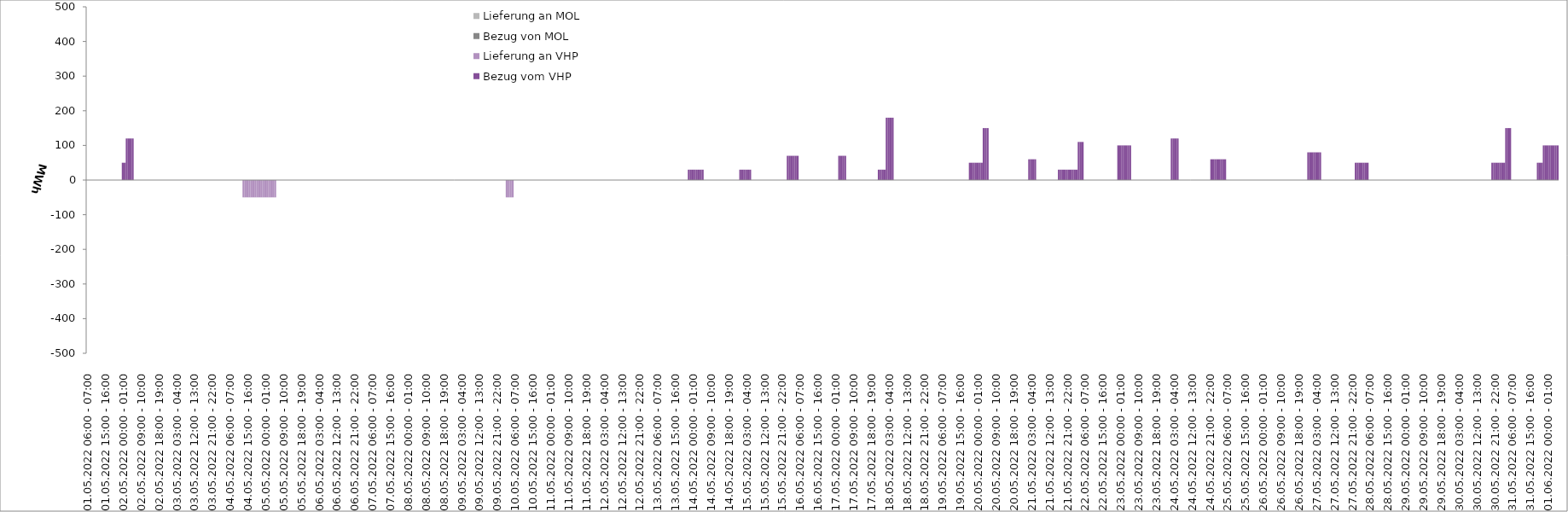
| Category | Bezug vom VHP | Lieferung an VHP | Bezug von MOL | Lieferung an MOL |
|---|---|---|---|---|
| 01.05.2022 06:00 - 07:00 | 0 | 0 | 0 | 0 |
| 01.05.2022 07:00 - 08:00 | 0 | 0 | 0 | 0 |
| 01.05.2022 08:00 - 09:00 | 0 | 0 | 0 | 0 |
| 01.05.2022 09:00 - 10:00 | 0 | 0 | 0 | 0 |
| 01.05.2022 10:00 - 11:00 | 0 | 0 | 0 | 0 |
| 01.05.2022 11:00 - 12:00 | 0 | 0 | 0 | 0 |
| 01.05.2022 12:00 - 13:00 | 0 | 0 | 0 | 0 |
| 01.05.2022 13:00 - 14:00 | 0 | 0 | 0 | 0 |
| 01.05.2022 14:00 - 15:00 | 0 | 0 | 0 | 0 |
| 01.05.2022 15:00 - 16:00 | 0 | 0 | 0 | 0 |
| 01.05.2022 16:00 - 17:00 | 0 | 0 | 0 | 0 |
| 01.05.2022 17:00 - 18:00 | 0 | 0 | 0 | 0 |
| 01.05.2022 18:00 - 19:00 | 0 | 0 | 0 | 0 |
| 01.05.2022 19:00 - 20:00 | 0 | 0 | 0 | 0 |
| 01.05.2022 20:00 - 21:00 | 0 | 0 | 0 | 0 |
| 01.05.2022 21:00 - 22:00 | 0 | 0 | 0 | 0 |
| 01.05.2022 22:00 - 23:00 | 0 | 0 | 0 | 0 |
| 01.05.2022 23:00 - 24:00 | 0 | 0 | 0 | 0 |
| 02.05.2022 00:00 - 01:00 | 50 | 0 | 0 | 0 |
| 02.05.2022 01:00 - 02:00 | 50 | 0 | 0 | 0 |
| 02.05.2022 02:00 - 03:00 | 120 | 0 | 0 | 0 |
| 02.05.2022 03:00 - 04:00 | 120 | 0 | 0 | 0 |
| 02.05.2022 04:00 - 05:00 | 120 | 0 | 0 | 0 |
| 02.05.2022 05:00 - 06:00 | 120 | 0 | 0 | 0 |
| 02.05.2022 06:00 - 07:00 | 0 | 0 | 0 | 0 |
| 02.05.2022 07:00 - 08:00 | 0 | 0 | 0 | 0 |
| 02.05.2022 08:00 - 09:00 | 0 | 0 | 0 | 0 |
| 02.05.2022 09:00 - 10:00 | 0 | 0 | 0 | 0 |
| 02.05.2022 10:00 - 11:00 | 0 | 0 | 0 | 0 |
| 02.05.2022 11:00 - 12:00 | 0 | 0 | 0 | 0 |
| 02.05.2022 12:00 - 13:00 | 0 | 0 | 0 | 0 |
| 02.05.2022 13:00 - 14:00 | 0 | 0 | 0 | 0 |
| 02.05.2022 14:00 - 15:00 | 0 | 0 | 0 | 0 |
| 02.05.2022 15:00 - 16:00 | 0 | 0 | 0 | 0 |
| 02.05.2022 16:00 - 17:00 | 0 | 0 | 0 | 0 |
| 02.05.2022 17:00 - 18:00 | 0 | 0 | 0 | 0 |
| 02.05.2022 18:00 - 19:00 | 0 | 0 | 0 | 0 |
| 02.05.2022 19:00 - 20:00 | 0 | 0 | 0 | 0 |
| 02.05.2022 20:00 - 21:00 | 0 | 0 | 0 | 0 |
| 02.05.2022 21:00 - 22:00 | 0 | 0 | 0 | 0 |
| 02.05.2022 22:00 - 23:00 | 0 | 0 | 0 | 0 |
| 02.05.2022 23:00 - 24:00 | 0 | 0 | 0 | 0 |
| 03.05.2022 00:00 - 01:00 | 0 | 0 | 0 | 0 |
| 03.05.2022 01:00 - 02:00 | 0 | 0 | 0 | 0 |
| 03.05.2022 02:00 - 03:00 | 0 | 0 | 0 | 0 |
| 03.05.2022 03:00 - 04:00 | 0 | 0 | 0 | 0 |
| 03.05.2022 04:00 - 05:00 | 0 | 0 | 0 | 0 |
| 03.05.2022 05:00 - 06:00 | 0 | 0 | 0 | 0 |
| 03.05.2022 06:00 - 07:00 | 0 | 0 | 0 | 0 |
| 03.05.2022 07:00 - 08:00 | 0 | 0 | 0 | 0 |
| 03.05.2022 08:00 - 09:00 | 0 | 0 | 0 | 0 |
| 03.05.2022 09:00 - 10:00 | 0 | 0 | 0 | 0 |
| 03.05.2022 10:00 - 11:00 | 0 | 0 | 0 | 0 |
| 03.05.2022 11:00 - 12:00 | 0 | 0 | 0 | 0 |
| 03.05.2022 12:00 - 13:00 | 0 | 0 | 0 | 0 |
| 03.05.2022 13:00 - 14:00 | 0 | 0 | 0 | 0 |
| 03.05.2022 14:00 - 15:00 | 0 | 0 | 0 | 0 |
| 03.05.2022 15:00 - 16:00 | 0 | 0 | 0 | 0 |
| 03.05.2022 16:00 - 17:00 | 0 | 0 | 0 | 0 |
| 03.05.2022 17:00 - 18:00 | 0 | 0 | 0 | 0 |
| 03.05.2022 18:00 - 19:00 | 0 | 0 | 0 | 0 |
| 03.05.2022 19:00 - 20:00 | 0 | 0 | 0 | 0 |
| 03.05.2022 20:00 - 21:00 | 0 | 0 | 0 | 0 |
| 03.05.2022 21:00 - 22:00 | 0 | 0 | 0 | 0 |
| 03.05.2022 22:00 - 23:00 | 0 | 0 | 0 | 0 |
| 03.05.2022 23:00 - 24:00 | 0 | 0 | 0 | 0 |
| 04.05.2022 00:00 - 01:00 | 0 | 0 | 0 | 0 |
| 04.05.2022 01:00 - 02:00 | 0 | 0 | 0 | 0 |
| 04.05.2022 02:00 - 03:00 | 0 | 0 | 0 | 0 |
| 04.05.2022 03:00 - 04:00 | 0 | 0 | 0 | 0 |
| 04.05.2022 04:00 - 05:00 | 0 | 0 | 0 | 0 |
| 04.05.2022 05:00 - 06:00 | 0 | 0 | 0 | 0 |
| 04.05.2022 06:00 - 07:00 | 0 | 0 | 0 | 0 |
| 04.05.2022 07:00 - 08:00 | 0 | 0 | 0 | 0 |
| 04.05.2022 08:00 - 09:00 | 0 | 0 | 0 | 0 |
| 04.05.2022 09:00 - 10:00 | 0 | 0 | 0 | 0 |
| 04.05.2022 10:00 - 11:00 | 0 | 0 | 0 | 0 |
| 04.05.2022 11:00 - 12:00 | 0 | 0 | 0 | 0 |
| 04.05.2022 12:00 - 13:00 | 0 | 0 | 0 | 0 |
| 04.05.2022 13:00 - 14:00 | 0 | -50 | 0 | 0 |
| 04.05.2022 14:00 - 15:00 | 0 | -50 | 0 | 0 |
| 04.05.2022 15:00 - 16:00 | 0 | -50 | 0 | 0 |
| 04.05.2022 16:00 - 17:00 | 0 | -50 | 0 | 0 |
| 04.05.2022 17:00 - 18:00 | 0 | -50 | 0 | 0 |
| 04.05.2022 18:00 - 19:00 | 0 | -50 | 0 | 0 |
| 04.05.2022 19:00 - 20:00 | 0 | -50 | 0 | 0 |
| 04.05.2022 20:00 - 21:00 | 0 | -50 | 0 | 0 |
| 04.05.2022 21:00 - 22:00 | 0 | -50 | 0 | 0 |
| 04.05.2022 22:00 - 23:00 | 0 | -50 | 0 | 0 |
| 04.05.2022 23:00 - 24:00 | 0 | -50 | 0 | 0 |
| 05.05.2022 00:00 - 01:00 | 0 | -50 | 0 | 0 |
| 05.05.2022 01:00 - 02:00 | 0 | -50 | 0 | 0 |
| 05.05.2022 02:00 - 03:00 | 0 | -50 | 0 | 0 |
| 05.05.2022 03:00 - 04:00 | 0 | -50 | 0 | 0 |
| 05.05.2022 04:00 - 05:00 | 0 | -50 | 0 | 0 |
| 05.05.2022 05:00 - 06:00 | 0 | -50 | 0 | 0 |
| 05.05.2022 06:00 - 07:00 | 0 | 0 | 0 | 0 |
| 05.05.2022 07:00 - 08:00 | 0 | 0 | 0 | 0 |
| 05.05.2022 08:00 - 09:00 | 0 | 0 | 0 | 0 |
| 05.05.2022 09:00 - 10:00 | 0 | 0 | 0 | 0 |
| 05.05.2022 10:00 - 11:00 | 0 | 0 | 0 | 0 |
| 05.05.2022 11:00 - 12:00 | 0 | 0 | 0 | 0 |
| 05.05.2022 12:00 - 13:00 | 0 | 0 | 0 | 0 |
| 05.05.2022 13:00 - 14:00 | 0 | 0 | 0 | 0 |
| 05.05.2022 14:00 - 15:00 | 0 | 0 | 0 | 0 |
| 05.05.2022 15:00 - 16:00 | 0 | 0 | 0 | 0 |
| 05.05.2022 16:00 - 17:00 | 0 | 0 | 0 | 0 |
| 05.05.2022 17:00 - 18:00 | 0 | 0 | 0 | 0 |
| 05.05.2022 18:00 - 19:00 | 0 | 0 | 0 | 0 |
| 05.05.2022 19:00 - 20:00 | 0 | 0 | 0 | 0 |
| 05.05.2022 20:00 - 21:00 | 0 | 0 | 0 | 0 |
| 05.05.2022 21:00 - 22:00 | 0 | 0 | 0 | 0 |
| 05.05.2022 22:00 - 23:00 | 0 | 0 | 0 | 0 |
| 05.05.2022 23:00 - 24:00 | 0 | 0 | 0 | 0 |
| 06.05.2022 00:00 - 01:00 | 0 | 0 | 0 | 0 |
| 06.05.2022 01:00 - 02:00 | 0 | 0 | 0 | 0 |
| 06.05.2022 02:00 - 03:00 | 0 | 0 | 0 | 0 |
| 06.05.2022 03:00 - 04:00 | 0 | 0 | 0 | 0 |
| 06.05.2022 04:00 - 05:00 | 0 | 0 | 0 | 0 |
| 06.05.2022 05:00 - 06:00 | 0 | 0 | 0 | 0 |
| 06.05.2022 06:00 - 07:00 | 0 | 0 | 0 | 0 |
| 06.05.2022 07:00 - 08:00 | 0 | 0 | 0 | 0 |
| 06.05.2022 08:00 - 09:00 | 0 | 0 | 0 | 0 |
| 06.05.2022 09:00 - 10:00 | 0 | 0 | 0 | 0 |
| 06.05.2022 10:00 - 11:00 | 0 | 0 | 0 | 0 |
| 06.05.2022 11:00 - 12:00 | 0 | 0 | 0 | 0 |
| 06.05.2022 12:00 - 13:00 | 0 | 0 | 0 | 0 |
| 06.05.2022 13:00 - 14:00 | 0 | 0 | 0 | 0 |
| 06.05.2022 14:00 - 15:00 | 0 | 0 | 0 | 0 |
| 06.05.2022 15:00 - 16:00 | 0 | 0 | 0 | 0 |
| 06.05.2022 16:00 - 17:00 | 0 | 0 | 0 | 0 |
| 06.05.2022 17:00 - 18:00 | 0 | 0 | 0 | 0 |
| 06.05.2022 18:00 - 19:00 | 0 | 0 | 0 | 0 |
| 06.05.2022 19:00 - 20:00 | 0 | 0 | 0 | 0 |
| 06.05.2022 20:00 - 21:00 | 0 | 0 | 0 | 0 |
| 06.05.2022 21:00 - 22:00 | 0 | 0 | 0 | 0 |
| 06.05.2022 22:00 - 23:00 | 0 | 0 | 0 | 0 |
| 06.05.2022 23:00 - 24:00 | 0 | 0 | 0 | 0 |
| 07.05.2022 00:00 - 01:00 | 0 | 0 | 0 | 0 |
| 07.05.2022 01:00 - 02:00 | 0 | 0 | 0 | 0 |
| 07.05.2022 02:00 - 03:00 | 0 | 0 | 0 | 0 |
| 07.05.2022 03:00 - 04:00 | 0 | 0 | 0 | 0 |
| 07.05.2022 04:00 - 05:00 | 0 | 0 | 0 | 0 |
| 07.05.2022 05:00 - 06:00 | 0 | 0 | 0 | 0 |
| 07.05.2022 06:00 - 07:00 | 0 | 0 | 0 | 0 |
| 07.05.2022 07:00 - 08:00 | 0 | 0 | 0 | 0 |
| 07.05.2022 08:00 - 09:00 | 0 | 0 | 0 | 0 |
| 07.05.2022 09:00 - 10:00 | 0 | 0 | 0 | 0 |
| 07.05.2022 10:00 - 11:00 | 0 | 0 | 0 | 0 |
| 07.05.2022 11:00 - 12:00 | 0 | 0 | 0 | 0 |
| 07.05.2022 12:00 - 13:00 | 0 | 0 | 0 | 0 |
| 07.05.2022 13:00 - 14:00 | 0 | 0 | 0 | 0 |
| 07.05.2022 14:00 - 15:00 | 0 | 0 | 0 | 0 |
| 07.05.2022 15:00 - 16:00 | 0 | 0 | 0 | 0 |
| 07.05.2022 16:00 - 17:00 | 0 | 0 | 0 | 0 |
| 07.05.2022 17:00 - 18:00 | 0 | 0 | 0 | 0 |
| 07.05.2022 18:00 - 19:00 | 0 | 0 | 0 | 0 |
| 07.05.2022 19:00 - 20:00 | 0 | 0 | 0 | 0 |
| 07.05.2022 20:00 - 21:00 | 0 | 0 | 0 | 0 |
| 07.05.2022 21:00 - 22:00 | 0 | 0 | 0 | 0 |
| 07.05.2022 22:00 - 23:00 | 0 | 0 | 0 | 0 |
| 07.05.2022 23:00 - 24:00 | 0 | 0 | 0 | 0 |
| 08.05.2022 00:00 - 01:00 | 0 | 0 | 0 | 0 |
| 08.05.2022 01:00 - 02:00 | 0 | 0 | 0 | 0 |
| 08.05.2022 02:00 - 03:00 | 0 | 0 | 0 | 0 |
| 08.05.2022 03:00 - 04:00 | 0 | 0 | 0 | 0 |
| 08.05.2022 04:00 - 05:00 | 0 | 0 | 0 | 0 |
| 08.05.2022 05:00 - 06:00 | 0 | 0 | 0 | 0 |
| 08.05.2022 06:00 - 07:00 | 0 | 0 | 0 | 0 |
| 08.05.2022 07:00 - 08:00 | 0 | 0 | 0 | 0 |
| 08.05.2022 08:00 - 09:00 | 0 | 0 | 0 | 0 |
| 08.05.2022 09:00 - 10:00 | 0 | 0 | 0 | 0 |
| 08.05.2022 10:00 - 11:00 | 0 | 0 | 0 | 0 |
| 08.05.2022 11:00 - 12:00 | 0 | 0 | 0 | 0 |
| 08.05.2022 12:00 - 13:00 | 0 | 0 | 0 | 0 |
| 08.05.2022 13:00 - 14:00 | 0 | 0 | 0 | 0 |
| 08.05.2022 14:00 - 15:00 | 0 | 0 | 0 | 0 |
| 08.05.2022 15:00 - 16:00 | 0 | 0 | 0 | 0 |
| 08.05.2022 16:00 - 17:00 | 0 | 0 | 0 | 0 |
| 08.05.2022 17:00 - 18:00 | 0 | 0 | 0 | 0 |
| 08.05.2022 18:00 - 19:00 | 0 | 0 | 0 | 0 |
| 08.05.2022 19:00 - 20:00 | 0 | 0 | 0 | 0 |
| 08.05.2022 20:00 - 21:00 | 0 | 0 | 0 | 0 |
| 08.05.2022 21:00 - 22:00 | 0 | 0 | 0 | 0 |
| 08.05.2022 22:00 - 23:00 | 0 | 0 | 0 | 0 |
| 08.05.2022 23:00 - 24:00 | 0 | 0 | 0 | 0 |
| 09.05.2022 00:00 - 01:00 | 0 | 0 | 0 | 0 |
| 09.05.2022 01:00 - 02:00 | 0 | 0 | 0 | 0 |
| 09.05.2022 02:00 - 03:00 | 0 | 0 | 0 | 0 |
| 09.05.2022 03:00 - 04:00 | 0 | 0 | 0 | 0 |
| 09.05.2022 04:00 - 05:00 | 0 | 0 | 0 | 0 |
| 09.05.2022 05:00 - 06:00 | 0 | 0 | 0 | 0 |
| 09.05.2022 06:00 - 07:00 | 0 | 0 | 0 | 0 |
| 09.05.2022 07:00 - 08:00 | 0 | 0 | 0 | 0 |
| 09.05.2022 08:00 - 09:00 | 0 | 0 | 0 | 0 |
| 09.05.2022 09:00 - 10:00 | 0 | 0 | 0 | 0 |
| 09.05.2022 10:00 - 11:00 | 0 | 0 | 0 | 0 |
| 09.05.2022 11:00 - 12:00 | 0 | 0 | 0 | 0 |
| 09.05.2022 12:00 - 13:00 | 0 | 0 | 0 | 0 |
| 09.05.2022 13:00 - 14:00 | 0 | 0 | 0 | 0 |
| 09.05.2022 14:00 - 15:00 | 0 | 0 | 0 | 0 |
| 09.05.2022 15:00 - 16:00 | 0 | 0 | 0 | 0 |
| 09.05.2022 16:00 - 17:00 | 0 | 0 | 0 | 0 |
| 09.05.2022 17:00 - 18:00 | 0 | 0 | 0 | 0 |
| 09.05.2022 18:00 - 19:00 | 0 | 0 | 0 | 0 |
| 09.05.2022 19:00 - 20:00 | 0 | 0 | 0 | 0 |
| 09.05.2022 20:00 - 21:00 | 0 | 0 | 0 | 0 |
| 09.05.2022 21:00 - 22:00 | 0 | 0 | 0 | 0 |
| 09.05.2022 22:00 - 23:00 | 0 | 0 | 0 | 0 |
| 09.05.2022 23:00 - 24:00 | 0 | 0 | 0 | 0 |
| 10.05.2022 00:00 - 01:00 | 0 | 0 | 0 | 0 |
| 10.05.2022 01:00 - 02:00 | 0 | 0 | 0 | 0 |
| 10.05.2022 02:00 - 03:00 | 0 | -50 | 0 | 0 |
| 10.05.2022 03:00 - 04:00 | 0 | -50 | 0 | 0 |
| 10.05.2022 04:00 - 05:00 | 0 | -50 | 0 | 0 |
| 10.05.2022 05:00 - 06:00 | 0 | -50 | 0 | 0 |
| 10.05.2022 06:00 - 07:00 | 0 | 0 | 0 | 0 |
| 10.05.2022 07:00 - 08:00 | 0 | 0 | 0 | 0 |
| 10.05.2022 08:00 - 09:00 | 0 | 0 | 0 | 0 |
| 10.05.2022 09:00 - 10:00 | 0 | 0 | 0 | 0 |
| 10.05.2022 10:00 - 11:00 | 0 | 0 | 0 | 0 |
| 10.05.2022 11:00 - 12:00 | 0 | 0 | 0 | 0 |
| 10.05.2022 12:00 - 13:00 | 0 | 0 | 0 | 0 |
| 10.05.2022 13:00 - 14:00 | 0 | 0 | 0 | 0 |
| 10.05.2022 14:00 - 15:00 | 0 | 0 | 0 | 0 |
| 10.05.2022 15:00 - 16:00 | 0 | 0 | 0 | 0 |
| 10.05.2022 16:00 - 17:00 | 0 | 0 | 0 | 0 |
| 10.05.2022 17:00 - 18:00 | 0 | 0 | 0 | 0 |
| 10.05.2022 18:00 - 19:00 | 0 | 0 | 0 | 0 |
| 10.05.2022 19:00 - 20:00 | 0 | 0 | 0 | 0 |
| 10.05.2022 20:00 - 21:00 | 0 | 0 | 0 | 0 |
| 10.05.2022 21:00 - 22:00 | 0 | 0 | 0 | 0 |
| 10.05.2022 22:00 - 23:00 | 0 | 0 | 0 | 0 |
| 10.05.2022 23:00 - 24:00 | 0 | 0 | 0 | 0 |
| 11.05.2022 00:00 - 01:00 | 0 | 0 | 0 | 0 |
| 11.05.2022 01:00 - 02:00 | 0 | 0 | 0 | 0 |
| 11.05.2022 02:00 - 03:00 | 0 | 0 | 0 | 0 |
| 11.05.2022 03:00 - 04:00 | 0 | 0 | 0 | 0 |
| 11.05.2022 04:00 - 05:00 | 0 | 0 | 0 | 0 |
| 11.05.2022 05:00 - 06:00 | 0 | 0 | 0 | 0 |
| 11.05.2022 06:00 - 07:00 | 0 | 0 | 0 | 0 |
| 11.05.2022 07:00 - 08:00 | 0 | 0 | 0 | 0 |
| 11.05.2022 08:00 - 09:00 | 0 | 0 | 0 | 0 |
| 11.05.2022 09:00 - 10:00 | 0 | 0 | 0 | 0 |
| 11.05.2022 10:00 - 11:00 | 0 | 0 | 0 | 0 |
| 11.05.2022 11:00 - 12:00 | 0 | 0 | 0 | 0 |
| 11.05.2022 12:00 - 13:00 | 0 | 0 | 0 | 0 |
| 11.05.2022 13:00 - 14:00 | 0 | 0 | 0 | 0 |
| 11.05.2022 14:00 - 15:00 | 0 | 0 | 0 | 0 |
| 11.05.2022 15:00 - 16:00 | 0 | 0 | 0 | 0 |
| 11.05.2022 16:00 - 17:00 | 0 | 0 | 0 | 0 |
| 11.05.2022 17:00 - 18:00 | 0 | 0 | 0 | 0 |
| 11.05.2022 18:00 - 19:00 | 0 | 0 | 0 | 0 |
| 11.05.2022 19:00 - 20:00 | 0 | 0 | 0 | 0 |
| 11.05.2022 20:00 - 21:00 | 0 | 0 | 0 | 0 |
| 11.05.2022 21:00 - 22:00 | 0 | 0 | 0 | 0 |
| 11.05.2022 22:00 - 23:00 | 0 | 0 | 0 | 0 |
| 11.05.2022 23:00 - 24:00 | 0 | 0 | 0 | 0 |
| 12.05.2022 00:00 - 01:00 | 0 | 0 | 0 | 0 |
| 12.05.2022 01:00 - 02:00 | 0 | 0 | 0 | 0 |
| 12.05.2022 02:00 - 03:00 | 0 | 0 | 0 | 0 |
| 12.05.2022 03:00 - 04:00 | 0 | 0 | 0 | 0 |
| 12.05.2022 04:00 - 05:00 | 0 | 0 | 0 | 0 |
| 12.05.2022 05:00 - 06:00 | 0 | 0 | 0 | 0 |
| 12.05.2022 06:00 - 07:00 | 0 | 0 | 0 | 0 |
| 12.05.2022 07:00 - 08:00 | 0 | 0 | 0 | 0 |
| 12.05.2022 08:00 - 09:00 | 0 | 0 | 0 | 0 |
| 12.05.2022 09:00 - 10:00 | 0 | 0 | 0 | 0 |
| 12.05.2022 10:00 - 11:00 | 0 | 0 | 0 | 0 |
| 12.05.2022 11:00 - 12:00 | 0 | 0 | 0 | 0 |
| 12.05.2022 12:00 - 13:00 | 0 | 0 | 0 | 0 |
| 12.05.2022 13:00 - 14:00 | 0 | 0 | 0 | 0 |
| 12.05.2022 14:00 - 15:00 | 0 | 0 | 0 | 0 |
| 12.05.2022 15:00 - 16:00 | 0 | 0 | 0 | 0 |
| 12.05.2022 16:00 - 17:00 | 0 | 0 | 0 | 0 |
| 12.05.2022 17:00 - 18:00 | 0 | 0 | 0 | 0 |
| 12.05.2022 18:00 - 19:00 | 0 | 0 | 0 | 0 |
| 12.05.2022 19:00 - 20:00 | 0 | 0 | 0 | 0 |
| 12.05.2022 20:00 - 21:00 | 0 | 0 | 0 | 0 |
| 12.05.2022 21:00 - 22:00 | 0 | 0 | 0 | 0 |
| 12.05.2022 22:00 - 23:00 | 0 | 0 | 0 | 0 |
| 12.05.2022 23:00 - 24:00 | 0 | 0 | 0 | 0 |
| 13.05.2022 00:00 - 01:00 | 0 | 0 | 0 | 0 |
| 13.05.2022 01:00 - 02:00 | 0 | 0 | 0 | 0 |
| 13.05.2022 02:00 - 03:00 | 0 | 0 | 0 | 0 |
| 13.05.2022 03:00 - 04:00 | 0 | 0 | 0 | 0 |
| 13.05.2022 04:00 - 05:00 | 0 | 0 | 0 | 0 |
| 13.05.2022 05:00 - 06:00 | 0 | 0 | 0 | 0 |
| 13.05.2022 06:00 - 07:00 | 0 | 0 | 0 | 0 |
| 13.05.2022 07:00 - 08:00 | 0 | 0 | 0 | 0 |
| 13.05.2022 08:00 - 09:00 | 0 | 0 | 0 | 0 |
| 13.05.2022 09:00 - 10:00 | 0 | 0 | 0 | 0 |
| 13.05.2022 10:00 - 11:00 | 0 | 0 | 0 | 0 |
| 13.05.2022 11:00 - 12:00 | 0 | 0 | 0 | 0 |
| 13.05.2022 12:00 - 13:00 | 0 | 0 | 0 | 0 |
| 13.05.2022 13:00 - 14:00 | 0 | 0 | 0 | 0 |
| 13.05.2022 14:00 - 15:00 | 0 | 0 | 0 | 0 |
| 13.05.2022 15:00 - 16:00 | 0 | 0 | 0 | 0 |
| 13.05.2022 16:00 - 17:00 | 0 | 0 | 0 | 0 |
| 13.05.2022 17:00 - 18:00 | 0 | 0 | 0 | 0 |
| 13.05.2022 18:00 - 19:00 | 0 | 0 | 0 | 0 |
| 13.05.2022 19:00 - 20:00 | 0 | 0 | 0 | 0 |
| 13.05.2022 20:00 - 21:00 | 0 | 0 | 0 | 0 |
| 13.05.2022 21:00 - 22:00 | 0 | 0 | 0 | 0 |
| 13.05.2022 22:00 - 23:00 | 30 | 0 | 0 | 0 |
| 13.05.2022 23:00 - 24:00 | 30 | 0 | 0 | 0 |
| 14.05.2022 00:00 - 01:00 | 30 | 0 | 0 | 0 |
| 14.05.2022 01:00 - 02:00 | 30 | 0 | 0 | 0 |
| 14.05.2022 02:00 - 03:00 | 30 | 0 | 0 | 0 |
| 14.05.2022 03:00 - 04:00 | 30 | 0 | 0 | 0 |
| 14.05.2022 04:00 - 05:00 | 30 | 0 | 0 | 0 |
| 14.05.2022 05:00 - 06:00 | 30 | 0 | 0 | 0 |
| 14.05.2022 06:00 - 07:00 | 0 | 0 | 0 | 0 |
| 14.05.2022 07:00 - 08:00 | 0 | 0 | 0 | 0 |
| 14.05.2022 08:00 - 09:00 | 0 | 0 | 0 | 0 |
| 14.05.2022 09:00 - 10:00 | 0 | 0 | 0 | 0 |
| 14.05.2022 10:00 - 11:00 | 0 | 0 | 0 | 0 |
| 14.05.2022 11:00 - 12:00 | 0 | 0 | 0 | 0 |
| 14.05.2022 12:00 - 13:00 | 0 | 0 | 0 | 0 |
| 14.05.2022 13:00 - 14:00 | 0 | 0 | 0 | 0 |
| 14.05.2022 14:00 - 15:00 | 0 | 0 | 0 | 0 |
| 14.05.2022 15:00 - 16:00 | 0 | 0 | 0 | 0 |
| 14.05.2022 16:00 - 17:00 | 0 | 0 | 0 | 0 |
| 14.05.2022 17:00 - 18:00 | 0 | 0 | 0 | 0 |
| 14.05.2022 18:00 - 19:00 | 0 | 0 | 0 | 0 |
| 14.05.2022 19:00 - 20:00 | 0 | 0 | 0 | 0 |
| 14.05.2022 20:00 - 21:00 | 0 | 0 | 0 | 0 |
| 14.05.2022 21:00 - 22:00 | 0 | 0 | 0 | 0 |
| 14.05.2022 22:00 - 23:00 | 0 | 0 | 0 | 0 |
| 14.05.2022 23:00 - 24:00 | 0 | 0 | 0 | 0 |
| 15.05.2022 00:00 - 01:00 | 30 | 0 | 0 | 0 |
| 15.05.2022 01:00 - 02:00 | 30 | 0 | 0 | 0 |
| 15.05.2022 02:00 - 03:00 | 30 | 0 | 0 | 0 |
| 15.05.2022 03:00 - 04:00 | 30 | 0 | 0 | 0 |
| 15.05.2022 04:00 - 05:00 | 30 | 0 | 0 | 0 |
| 15.05.2022 05:00 - 06:00 | 30 | 0 | 0 | 0 |
| 15.05.2022 06:00 - 07:00 | 0 | 0 | 0 | 0 |
| 15.05.2022 07:00 - 08:00 | 0 | 0 | 0 | 0 |
| 15.05.2022 08:00 - 09:00 | 0 | 0 | 0 | 0 |
| 15.05.2022 09:00 - 10:00 | 0 | 0 | 0 | 0 |
| 15.05.2022 10:00 - 11:00 | 0 | 0 | 0 | 0 |
| 15.05.2022 11:00 - 12:00 | 0 | 0 | 0 | 0 |
| 15.05.2022 12:00 - 13:00 | 0 | 0 | 0 | 0 |
| 15.05.2022 13:00 - 14:00 | 0 | 0 | 0 | 0 |
| 15.05.2022 14:00 - 15:00 | 0 | 0 | 0 | 0 |
| 15.05.2022 15:00 - 16:00 | 0 | 0 | 0 | 0 |
| 15.05.2022 16:00 - 17:00 | 0 | 0 | 0 | 0 |
| 15.05.2022 17:00 - 18:00 | 0 | 0 | 0 | 0 |
| 15.05.2022 18:00 - 19:00 | 0 | 0 | 0 | 0 |
| 15.05.2022 19:00 - 20:00 | 0 | 0 | 0 | 0 |
| 15.05.2022 20:00 - 21:00 | 0 | 0 | 0 | 0 |
| 15.05.2022 21:00 - 22:00 | 0 | 0 | 0 | 0 |
| 15.05.2022 22:00 - 23:00 | 0 | 0 | 0 | 0 |
| 15.05.2022 23:00 - 24:00 | 0 | 0 | 0 | 0 |
| 16.05.2022 00:00 - 01:00 | 70 | 0 | 0 | 0 |
| 16.05.2022 01:00 - 02:00 | 70 | 0 | 0 | 0 |
| 16.05.2022 02:00 - 03:00 | 70 | 0 | 0 | 0 |
| 16.05.2022 03:00 - 04:00 | 70 | 0 | 0 | 0 |
| 16.05.2022 04:00 - 05:00 | 70 | 0 | 0 | 0 |
| 16.05.2022 05:00 - 06:00 | 70 | 0 | 0 | 0 |
| 16.05.2022 06:00 - 07:00 | 0 | 0 | 0 | 0 |
| 16.05.2022 07:00 - 08:00 | 0 | 0 | 0 | 0 |
| 16.05.2022 08:00 - 09:00 | 0 | 0 | 0 | 0 |
| 16.05.2022 09:00 - 10:00 | 0 | 0 | 0 | 0 |
| 16.05.2022 10:00 - 11:00 | 0 | 0 | 0 | 0 |
| 16.05.2022 11:00 - 12:00 | 0 | 0 | 0 | 0 |
| 16.05.2022 12:00 - 13:00 | 0 | 0 | 0 | 0 |
| 16.05.2022 13:00 - 14:00 | 0 | 0 | 0 | 0 |
| 16.05.2022 14:00 - 15:00 | 0 | 0 | 0 | 0 |
| 16.05.2022 15:00 - 16:00 | 0 | 0 | 0 | 0 |
| 16.05.2022 16:00 - 17:00 | 0 | 0 | 0 | 0 |
| 16.05.2022 17:00 - 18:00 | 0 | 0 | 0 | 0 |
| 16.05.2022 18:00 - 19:00 | 0 | 0 | 0 | 0 |
| 16.05.2022 19:00 - 20:00 | 0 | 0 | 0 | 0 |
| 16.05.2022 20:00 - 21:00 | 0 | 0 | 0 | 0 |
| 16.05.2022 21:00 - 22:00 | 0 | 0 | 0 | 0 |
| 16.05.2022 22:00 - 23:00 | 0 | 0 | 0 | 0 |
| 16.05.2022 23:00 - 24:00 | 0 | 0 | 0 | 0 |
| 17.05.2022 00:00 - 01:00 | 0 | 0 | 0 | 0 |
| 17.05.2022 01:00 - 02:00 | 0 | 0 | 0 | 0 |
| 17.05.2022 02:00 - 03:00 | 70 | 0 | 0 | 0 |
| 17.05.2022 03:00 - 04:00 | 70 | 0 | 0 | 0 |
| 17.05.2022 04:00 - 05:00 | 70 | 0 | 0 | 0 |
| 17.05.2022 05:00 - 06:00 | 70 | 0 | 0 | 0 |
| 17.05.2022 06:00 - 07:00 | 0 | 0 | 0 | 0 |
| 17.05.2022 07:00 - 08:00 | 0 | 0 | 0 | 0 |
| 17.05.2022 08:00 - 09:00 | 0 | 0 | 0 | 0 |
| 17.05.2022 09:00 - 10:00 | 0 | 0 | 0 | 0 |
| 17.05.2022 10:00 - 11:00 | 0 | 0 | 0 | 0 |
| 17.05.2022 11:00 - 12:00 | 0 | 0 | 0 | 0 |
| 17.05.2022 12:00 - 13:00 | 0 | 0 | 0 | 0 |
| 17.05.2022 13:00 - 14:00 | 0 | 0 | 0 | 0 |
| 17.05.2022 14:00 - 15:00 | 0 | 0 | 0 | 0 |
| 17.05.2022 15:00 - 16:00 | 0 | 0 | 0 | 0 |
| 17.05.2022 16:00 - 17:00 | 0 | 0 | 0 | 0 |
| 17.05.2022 17:00 - 18:00 | 0 | 0 | 0 | 0 |
| 17.05.2022 18:00 - 19:00 | 0 | 0 | 0 | 0 |
| 17.05.2022 19:00 - 20:00 | 0 | 0 | 0 | 0 |
| 17.05.2022 20:00 - 21:00 | 0 | 0 | 0 | 0 |
| 17.05.2022 21:00 - 22:00 | 0 | 0 | 0 | 0 |
| 17.05.2022 22:00 - 23:00 | 30 | 0 | 0 | 0 |
| 17.05.2022 23:00 - 24:00 | 30 | 0 | 0 | 0 |
| 18.05.2022 00:00 - 01:00 | 30 | 0 | 0 | 0 |
| 18.05.2022 01:00 - 02:00 | 30 | 0 | 0 | 0 |
| 18.05.2022 02:00 - 03:00 | 180 | 0 | 0 | 0 |
| 18.05.2022 03:00 - 04:00 | 180 | 0 | 0 | 0 |
| 18.05.2022 04:00 - 05:00 | 180 | 0 | 0 | 0 |
| 18.05.2022 05:00 - 06:00 | 180 | 0 | 0 | 0 |
| 18.05.2022 06:00 - 07:00 | 0 | 0 | 0 | 0 |
| 18.05.2022 07:00 - 08:00 | 0 | 0 | 0 | 0 |
| 18.05.2022 08:00 - 09:00 | 0 | 0 | 0 | 0 |
| 18.05.2022 09:00 - 10:00 | 0 | 0 | 0 | 0 |
| 18.05.2022 10:00 - 11:00 | 0 | 0 | 0 | 0 |
| 18.05.2022 11:00 - 12:00 | 0 | 0 | 0 | 0 |
| 18.05.2022 12:00 - 13:00 | 0 | 0 | 0 | 0 |
| 18.05.2022 13:00 - 14:00 | 0 | 0 | 0 | 0 |
| 18.05.2022 14:00 - 15:00 | 0 | 0 | 0 | 0 |
| 18.05.2022 15:00 - 16:00 | 0 | 0 | 0 | 0 |
| 18.05.2022 16:00 - 17:00 | 0 | 0 | 0 | 0 |
| 18.05.2022 17:00 - 18:00 | 0 | 0 | 0 | 0 |
| 18.05.2022 18:00 - 19:00 | 0 | 0 | 0 | 0 |
| 18.05.2022 19:00 - 20:00 | 0 | 0 | 0 | 0 |
| 18.05.2022 20:00 - 21:00 | 0 | 0 | 0 | 0 |
| 18.05.2022 21:00 - 22:00 | 0 | 0 | 0 | 0 |
| 18.05.2022 22:00 - 23:00 | 0 | 0 | 0 | 0 |
| 18.05.2022 23:00 - 24:00 | 0 | 0 | 0 | 0 |
| 19.05.2022 00:00 - 01:00 | 0 | 0 | 0 | 0 |
| 19.05.2022 01:00 - 02:00 | 0 | 0 | 0 | 0 |
| 19.05.2022 02:00 - 03:00 | 0 | 0 | 0 | 0 |
| 19.05.2022 03:00 - 04:00 | 0 | 0 | 0 | 0 |
| 19.05.2022 04:00 - 05:00 | 0 | 0 | 0 | 0 |
| 19.05.2022 05:00 - 06:00 | 0 | 0 | 0 | 0 |
| 19.05.2022 06:00 - 07:00 | 0 | 0 | 0 | 0 |
| 19.05.2022 07:00 - 08:00 | 0 | 0 | 0 | 0 |
| 19.05.2022 08:00 - 09:00 | 0 | 0 | 0 | 0 |
| 19.05.2022 09:00 - 10:00 | 0 | 0 | 0 | 0 |
| 19.05.2022 10:00 - 11:00 | 0 | 0 | 0 | 0 |
| 19.05.2022 11:00 - 12:00 | 0 | 0 | 0 | 0 |
| 19.05.2022 12:00 - 13:00 | 0 | 0 | 0 | 0 |
| 19.05.2022 13:00 - 14:00 | 0 | 0 | 0 | 0 |
| 19.05.2022 14:00 - 15:00 | 0 | 0 | 0 | 0 |
| 19.05.2022 15:00 - 16:00 | 0 | 0 | 0 | 0 |
| 19.05.2022 16:00 - 17:00 | 0 | 0 | 0 | 0 |
| 19.05.2022 17:00 - 18:00 | 0 | 0 | 0 | 0 |
| 19.05.2022 18:00 - 19:00 | 0 | 0 | 0 | 0 |
| 19.05.2022 19:00 - 20:00 | 0 | 0 | 0 | 0 |
| 19.05.2022 20:00 - 21:00 | 50 | 0 | 0 | 0 |
| 19.05.2022 21:00 - 22:00 | 50 | 0 | 0 | 0 |
| 19.05.2022 22:00 - 23:00 | 50 | 0 | 0 | 0 |
| 19.05.2022 23:00 - 24:00 | 50 | 0 | 0 | 0 |
| 20.05.2022 00:00 - 01:00 | 50 | 0 | 0 | 0 |
| 20.05.2022 01:00 - 02:00 | 50 | 0 | 0 | 0 |
| 20.05.2022 02:00 - 03:00 | 50 | 0 | 0 | 0 |
| 20.05.2022 03:00 - 04:00 | 150 | 0 | 0 | 0 |
| 20.05.2022 04:00 - 05:00 | 150 | 0 | 0 | 0 |
| 20.05.2022 05:00 - 06:00 | 150 | 0 | 0 | 0 |
| 20.05.2022 06:00 - 07:00 | 0 | 0 | 0 | 0 |
| 20.05.2022 07:00 - 08:00 | 0 | 0 | 0 | 0 |
| 20.05.2022 08:00 - 09:00 | 0 | 0 | 0 | 0 |
| 20.05.2022 09:00 - 10:00 | 0 | 0 | 0 | 0 |
| 20.05.2022 10:00 - 11:00 | 0 | 0 | 0 | 0 |
| 20.05.2022 11:00 - 12:00 | 0 | 0 | 0 | 0 |
| 20.05.2022 12:00 - 13:00 | 0 | 0 | 0 | 0 |
| 20.05.2022 13:00 - 14:00 | 0 | 0 | 0 | 0 |
| 20.05.2022 14:00 - 15:00 | 0 | 0 | 0 | 0 |
| 20.05.2022 15:00 - 16:00 | 0 | 0 | 0 | 0 |
| 20.05.2022 16:00 - 17:00 | 0 | 0 | 0 | 0 |
| 20.05.2022 17:00 - 18:00 | 0 | 0 | 0 | 0 |
| 20.05.2022 18:00 - 19:00 | 0 | 0 | 0 | 0 |
| 20.05.2022 19:00 - 20:00 | 0 | 0 | 0 | 0 |
| 20.05.2022 20:00 - 21:00 | 0 | 0 | 0 | 0 |
| 20.05.2022 21:00 - 22:00 | 0 | 0 | 0 | 0 |
| 20.05.2022 22:00 - 23:00 | 0 | 0 | 0 | 0 |
| 20.05.2022 23:00 - 24:00 | 0 | 0 | 0 | 0 |
| 21.05.2022 00:00 - 01:00 | 0 | 0 | 0 | 0 |
| 21.05.2022 01:00 - 02:00 | 0 | 0 | 0 | 0 |
| 21.05.2022 02:00 - 03:00 | 60 | 0 | 0 | 0 |
| 21.05.2022 03:00 - 04:00 | 60 | 0 | 0 | 0 |
| 21.05.2022 04:00 - 05:00 | 60 | 0 | 0 | 0 |
| 21.05.2022 05:00 - 06:00 | 60 | 0 | 0 | 0 |
| 21.05.2022 06:00 - 07:00 | 0 | 0 | 0 | 0 |
| 21.05.2022 07:00 - 08:00 | 0 | 0 | 0 | 0 |
| 21.05.2022 08:00 - 09:00 | 0 | 0 | 0 | 0 |
| 21.05.2022 09:00 - 10:00 | 0 | 0 | 0 | 0 |
| 21.05.2022 10:00 - 11:00 | 0 | 0 | 0 | 0 |
| 21.05.2022 11:00 - 12:00 | 0 | 0 | 0 | 0 |
| 21.05.2022 12:00 - 13:00 | 0 | 0 | 0 | 0 |
| 21.05.2022 13:00 - 14:00 | 0 | 0 | 0 | 0 |
| 21.05.2022 14:00 - 15:00 | 0 | 0 | 0 | 0 |
| 21.05.2022 15:00 - 16:00 | 0 | 0 | 0 | 0 |
| 21.05.2022 16:00 - 17:00 | 0 | 0 | 0 | 0 |
| 21.05.2022 17:00 - 18:00 | 30 | 0 | 0 | 0 |
| 21.05.2022 18:00 - 19:00 | 30 | 0 | 0 | 0 |
| 21.05.2022 19:00 - 20:00 | 30 | 0 | 0 | 0 |
| 21.05.2022 20:00 - 21:00 | 30 | 0 | 0 | 0 |
| 21.05.2022 21:00 - 22:00 | 30 | 0 | 0 | 0 |
| 21.05.2022 22:00 - 23:00 | 30 | 0 | 0 | 0 |
| 21.05.2022 23:00 - 24:00 | 30 | 0 | 0 | 0 |
| 22.05.2022 00:00 - 01:00 | 30 | 0 | 0 | 0 |
| 22.05.2022 01:00 - 02:00 | 30 | 0 | 0 | 0 |
| 22.05.2022 02:00 - 03:00 | 30 | 0 | 0 | 0 |
| 22.05.2022 03:00 - 04:00 | 110 | 0 | 0 | 0 |
| 22.05.2022 04:00 - 05:00 | 110 | 0 | 0 | 0 |
| 22.05.2022 05:00 - 06:00 | 110 | 0 | 0 | 0 |
| 22.05.2022 06:00 - 07:00 | 0 | 0 | 0 | 0 |
| 22.05.2022 07:00 - 08:00 | 0 | 0 | 0 | 0 |
| 22.05.2022 08:00 - 09:00 | 0 | 0 | 0 | 0 |
| 22.05.2022 09:00 - 10:00 | 0 | 0 | 0 | 0 |
| 22.05.2022 10:00 - 11:00 | 0 | 0 | 0 | 0 |
| 22.05.2022 11:00 - 12:00 | 0 | 0 | 0 | 0 |
| 22.05.2022 12:00 - 13:00 | 0 | 0 | 0 | 0 |
| 22.05.2022 13:00 - 14:00 | 0 | 0 | 0 | 0 |
| 22.05.2022 14:00 - 15:00 | 0 | 0 | 0 | 0 |
| 22.05.2022 15:00 - 16:00 | 0 | 0 | 0 | 0 |
| 22.05.2022 16:00 - 17:00 | 0 | 0 | 0 | 0 |
| 22.05.2022 17:00 - 18:00 | 0 | 0 | 0 | 0 |
| 22.05.2022 18:00 - 19:00 | 0 | 0 | 0 | 0 |
| 22.05.2022 19:00 - 20:00 | 0 | 0 | 0 | 0 |
| 22.05.2022 20:00 - 21:00 | 0 | 0 | 0 | 0 |
| 22.05.2022 21:00 - 22:00 | 0 | 0 | 0 | 0 |
| 22.05.2022 22:00 - 23:00 | 0 | 0 | 0 | 0 |
| 22.05.2022 23:00 - 24:00 | 100 | 0 | 0 | 0 |
| 23.05.2022 00:00 - 01:00 | 100 | 0 | 0 | 0 |
| 23.05.2022 01:00 - 02:00 | 100 | 0 | 0 | 0 |
| 23.05.2022 02:00 - 03:00 | 100 | 0 | 0 | 0 |
| 23.05.2022 03:00 - 04:00 | 100 | 0 | 0 | 0 |
| 23.05.2022 04:00 - 05:00 | 100 | 0 | 0 | 0 |
| 23.05.2022 05:00 - 06:00 | 100 | 0 | 0 | 0 |
| 23.05.2022 06:00 - 07:00 | 0 | 0 | 0 | 0 |
| 23.05.2022 07:00 - 08:00 | 0 | 0 | 0 | 0 |
| 23.05.2022 08:00 - 09:00 | 0 | 0 | 0 | 0 |
| 23.05.2022 09:00 - 10:00 | 0 | 0 | 0 | 0 |
| 23.05.2022 10:00 - 11:00 | 0 | 0 | 0 | 0 |
| 23.05.2022 11:00 - 12:00 | 0 | 0 | 0 | 0 |
| 23.05.2022 12:00 - 13:00 | 0 | 0 | 0 | 0 |
| 23.05.2022 13:00 - 14:00 | 0 | 0 | 0 | 0 |
| 23.05.2022 14:00 - 15:00 | 0 | 0 | 0 | 0 |
| 23.05.2022 15:00 - 16:00 | 0 | 0 | 0 | 0 |
| 23.05.2022 16:00 - 17:00 | 0 | 0 | 0 | 0 |
| 23.05.2022 17:00 - 18:00 | 0 | 0 | 0 | 0 |
| 23.05.2022 18:00 - 19:00 | 0 | 0 | 0 | 0 |
| 23.05.2022 19:00 - 20:00 | 0 | 0 | 0 | 0 |
| 23.05.2022 20:00 - 21:00 | 0 | 0 | 0 | 0 |
| 23.05.2022 21:00 - 22:00 | 0 | 0 | 0 | 0 |
| 23.05.2022 22:00 - 23:00 | 0 | 0 | 0 | 0 |
| 23.05.2022 23:00 - 24:00 | 0 | 0 | 0 | 0 |
| 24.05.2022 00:00 - 01:00 | 0 | 0 | 0 | 0 |
| 24.05.2022 01:00 - 02:00 | 0 | 0 | 0 | 0 |
| 24.05.2022 02:00 - 03:00 | 120 | 0 | 0 | 0 |
| 24.05.2022 03:00 - 04:00 | 120 | 0 | 0 | 0 |
| 24.05.2022 04:00 - 05:00 | 120 | 0 | 0 | 0 |
| 24.05.2022 05:00 - 06:00 | 120 | 0 | 0 | 0 |
| 24.05.2022 06:00 - 07:00 | 0 | 0 | 0 | 0 |
| 24.05.2022 07:00 - 08:00 | 0 | 0 | 0 | 0 |
| 24.05.2022 08:00 - 09:00 | 0 | 0 | 0 | 0 |
| 24.05.2022 09:00 - 10:00 | 0 | 0 | 0 | 0 |
| 24.05.2022 10:00 - 11:00 | 0 | 0 | 0 | 0 |
| 24.05.2022 11:00 - 12:00 | 0 | 0 | 0 | 0 |
| 24.05.2022 12:00 - 13:00 | 0 | 0 | 0 | 0 |
| 24.05.2022 13:00 - 14:00 | 0 | 0 | 0 | 0 |
| 24.05.2022 14:00 - 15:00 | 0 | 0 | 0 | 0 |
| 24.05.2022 15:00 - 16:00 | 0 | 0 | 0 | 0 |
| 24.05.2022 16:00 - 17:00 | 0 | 0 | 0 | 0 |
| 24.05.2022 17:00 - 18:00 | 0 | 0 | 0 | 0 |
| 24.05.2022 18:00 - 19:00 | 0 | 0 | 0 | 0 |
| 24.05.2022 19:00 - 20:00 | 0 | 0 | 0 | 0 |
| 24.05.2022 20:00 - 21:00 | 0 | 0 | 0 | 0 |
| 24.05.2022 21:00 - 22:00 | 0 | 0 | 0 | 0 |
| 24.05.2022 22:00 - 23:00 | 60 | 0 | 0 | 0 |
| 24.05.2022 23:00 - 24:00 | 60 | 0 | 0 | 0 |
| 25.05.2022 00:00 - 01:00 | 60 | 0 | 0 | 0 |
| 25.05.2022 01:00 - 02:00 | 60 | 0 | 0 | 0 |
| 25.05.2022 02:00 - 03:00 | 60 | 0 | 0 | 0 |
| 25.05.2022 03:00 - 04:00 | 60 | 0 | 0 | 0 |
| 25.05.2022 04:00 - 05:00 | 60 | 0 | 0 | 0 |
| 25.05.2022 05:00 - 06:00 | 60 | 0 | 0 | 0 |
| 25.05.2022 06:00 - 07:00 | 0 | 0 | 0 | 0 |
| 25.05.2022 07:00 - 08:00 | 0 | 0 | 0 | 0 |
| 25.05.2022 08:00 - 09:00 | 0 | 0 | 0 | 0 |
| 25.05.2022 09:00 - 10:00 | 0 | 0 | 0 | 0 |
| 25.05.2022 10:00 - 11:00 | 0 | 0 | 0 | 0 |
| 25.05.2022 11:00 - 12:00 | 0 | 0 | 0 | 0 |
| 25.05.2022 12:00 - 13:00 | 0 | 0 | 0 | 0 |
| 25.05.2022 13:00 - 14:00 | 0 | 0 | 0 | 0 |
| 25.05.2022 14:00 - 15:00 | 0 | 0 | 0 | 0 |
| 25.05.2022 15:00 - 16:00 | 0 | 0 | 0 | 0 |
| 25.05.2022 16:00 - 17:00 | 0 | 0 | 0 | 0 |
| 25.05.2022 17:00 - 18:00 | 0 | 0 | 0 | 0 |
| 25.05.2022 18:00 - 19:00 | 0 | 0 | 0 | 0 |
| 25.05.2022 19:00 - 20:00 | 0 | 0 | 0 | 0 |
| 25.05.2022 20:00 - 21:00 | 0 | 0 | 0 | 0 |
| 25.05.2022 21:00 - 22:00 | 0 | 0 | 0 | 0 |
| 25.05.2022 22:00 - 23:00 | 0 | 0 | 0 | 0 |
| 25.05.2022 23:00 - 24:00 | 0 | 0 | 0 | 0 |
| 26.05.2022 00:00 - 01:00 | 0 | 0 | 0 | 0 |
| 26.05.2022 01:00 - 02:00 | 0 | 0 | 0 | 0 |
| 26.05.2022 02:00 - 03:00 | 0 | 0 | 0 | 0 |
| 26.05.2022 03:00 - 04:00 | 0 | 0 | 0 | 0 |
| 26.05.2022 04:00 - 05:00 | 0 | 0 | 0 | 0 |
| 26.05.2022 05:00 - 06:00 | 0 | 0 | 0 | 0 |
| 26.05.2022 06:00 - 07:00 | 0 | 0 | 0 | 0 |
| 26.05.2022 07:00 - 08:00 | 0 | 0 | 0 | 0 |
| 26.05.2022 08:00 - 09:00 | 0 | 0 | 0 | 0 |
| 26.05.2022 09:00 - 10:00 | 0 | 0 | 0 | 0 |
| 26.05.2022 10:00 - 11:00 | 0 | 0 | 0 | 0 |
| 26.05.2022 11:00 - 12:00 | 0 | 0 | 0 | 0 |
| 26.05.2022 12:00 - 13:00 | 0 | 0 | 0 | 0 |
| 26.05.2022 13:00 - 14:00 | 0 | 0 | 0 | 0 |
| 26.05.2022 14:00 - 15:00 | 0 | 0 | 0 | 0 |
| 26.05.2022 15:00 - 16:00 | 0 | 0 | 0 | 0 |
| 26.05.2022 16:00 - 17:00 | 0 | 0 | 0 | 0 |
| 26.05.2022 17:00 - 18:00 | 0 | 0 | 0 | 0 |
| 26.05.2022 18:00 - 19:00 | 0 | 0 | 0 | 0 |
| 26.05.2022 19:00 - 20:00 | 0 | 0 | 0 | 0 |
| 26.05.2022 20:00 - 21:00 | 0 | 0 | 0 | 0 |
| 26.05.2022 21:00 - 22:00 | 0 | 0 | 0 | 0 |
| 26.05.2022 22:00 - 23:00 | 0 | 0 | 0 | 0 |
| 26.05.2022 23:00 - 24:00 | 80 | 0 | 0 | 0 |
| 27.05.2022 00:00 - 01:00 | 80 | 0 | 0 | 0 |
| 27.05.2022 01:00 - 02:00 | 80 | 0 | 0 | 0 |
| 27.05.2022 02:00 - 03:00 | 80 | 0 | 0 | 0 |
| 27.05.2022 03:00 - 04:00 | 80 | 0 | 0 | 0 |
| 27.05.2022 04:00 - 05:00 | 80 | 0 | 0 | 0 |
| 27.05.2022 05:00 - 06:00 | 80 | 0 | 0 | 0 |
| 27.05.2022 06:00 - 07:00 | 0 | 0 | 0 | 0 |
| 27.05.2022 07:00 - 08:00 | 0 | 0 | 0 | 0 |
| 27.05.2022 08:00 - 09:00 | 0 | 0 | 0 | 0 |
| 27.05.2022 09:00 - 10:00 | 0 | 0 | 0 | 0 |
| 27.05.2022 10:00 - 11:00 | 0 | 0 | 0 | 0 |
| 27.05.2022 11:00 - 12:00 | 0 | 0 | 0 | 0 |
| 27.05.2022 12:00 - 13:00 | 0 | 0 | 0 | 0 |
| 27.05.2022 13:00 - 14:00 | 0 | 0 | 0 | 0 |
| 27.05.2022 14:00 - 15:00 | 0 | 0 | 0 | 0 |
| 27.05.2022 15:00 - 16:00 | 0 | 0 | 0 | 0 |
| 27.05.2022 16:00 - 17:00 | 0 | 0 | 0 | 0 |
| 27.05.2022 17:00 - 18:00 | 0 | 0 | 0 | 0 |
| 27.05.2022 18:00 - 19:00 | 0 | 0 | 0 | 0 |
| 27.05.2022 19:00 - 20:00 | 0 | 0 | 0 | 0 |
| 27.05.2022 20:00 - 21:00 | 0 | 0 | 0 | 0 |
| 27.05.2022 21:00 - 22:00 | 0 | 0 | 0 | 0 |
| 27.05.2022 22:00 - 23:00 | 0 | 0 | 0 | 0 |
| 27.05.2022 23:00 - 24:00 | 50 | 0 | 0 | 0 |
| 28.05.2022 00:00 - 01:00 | 50 | 0 | 0 | 0 |
| 28.05.2022 01:00 - 02:00 | 50 | 0 | 0 | 0 |
| 28.05.2022 02:00 - 03:00 | 50 | 0 | 0 | 0 |
| 28.05.2022 03:00 - 04:00 | 50 | 0 | 0 | 0 |
| 28.05.2022 04:00 - 05:00 | 50 | 0 | 0 | 0 |
| 28.05.2022 05:00 - 06:00 | 50 | 0 | 0 | 0 |
| 28.05.2022 06:00 - 07:00 | 0 | 0 | 0 | 0 |
| 28.05.2022 07:00 - 08:00 | 0 | 0 | 0 | 0 |
| 28.05.2022 08:00 - 09:00 | 0 | 0 | 0 | 0 |
| 28.05.2022 09:00 - 10:00 | 0 | 0 | 0 | 0 |
| 28.05.2022 10:00 - 11:00 | 0 | 0 | 0 | 0 |
| 28.05.2022 11:00 - 12:00 | 0 | 0 | 0 | 0 |
| 28.05.2022 12:00 - 13:00 | 0 | 0 | 0 | 0 |
| 28.05.2022 13:00 - 14:00 | 0 | 0 | 0 | 0 |
| 28.05.2022 14:00 - 15:00 | 0 | 0 | 0 | 0 |
| 28.05.2022 15:00 - 16:00 | 0 | 0 | 0 | 0 |
| 28.05.2022 16:00 - 17:00 | 0 | 0 | 0 | 0 |
| 28.05.2022 17:00 - 18:00 | 0 | 0 | 0 | 0 |
| 28.05.2022 18:00 - 19:00 | 0 | 0 | 0 | 0 |
| 28.05.2022 19:00 - 20:00 | 0 | 0 | 0 | 0 |
| 28.05.2022 20:00 - 21:00 | 0 | 0 | 0 | 0 |
| 28.05.2022 21:00 - 22:00 | 0 | 0 | 0 | 0 |
| 28.05.2022 22:00 - 23:00 | 0 | 0 | 0 | 0 |
| 28.05.2022 23:00 - 24:00 | 0 | 0 | 0 | 0 |
| 29.05.2022 00:00 - 01:00 | 0 | 0 | 0 | 0 |
| 29.05.2022 01:00 - 02:00 | 0 | 0 | 0 | 0 |
| 29.05.2022 02:00 - 03:00 | 0 | 0 | 0 | 0 |
| 29.05.2022 03:00 - 04:00 | 0 | 0 | 0 | 0 |
| 29.05.2022 04:00 - 05:00 | 0 | 0 | 0 | 0 |
| 29.05.2022 05:00 - 06:00 | 0 | 0 | 0 | 0 |
| 29.05.2022 06:00 - 07:00 | 0 | 0 | 0 | 0 |
| 29.05.2022 07:00 - 08:00 | 0 | 0 | 0 | 0 |
| 29.05.2022 08:00 - 09:00 | 0 | 0 | 0 | 0 |
| 29.05.2022 09:00 - 10:00 | 0 | 0 | 0 | 0 |
| 29.05.2022 10:00 - 11:00 | 0 | 0 | 0 | 0 |
| 29.05.2022 11:00 - 12:00 | 0 | 0 | 0 | 0 |
| 29.05.2022 12:00 - 13:00 | 0 | 0 | 0 | 0 |
| 29.05.2022 13:00 - 14:00 | 0 | 0 | 0 | 0 |
| 29.05.2022 14:00 - 15:00 | 0 | 0 | 0 | 0 |
| 29.05.2022 15:00 - 16:00 | 0 | 0 | 0 | 0 |
| 29.05.2022 16:00 - 17:00 | 0 | 0 | 0 | 0 |
| 29.05.2022 17:00 - 18:00 | 0 | 0 | 0 | 0 |
| 29.05.2022 18:00 - 19:00 | 0 | 0 | 0 | 0 |
| 29.05.2022 19:00 - 20:00 | 0 | 0 | 0 | 0 |
| 29.05.2022 20:00 - 21:00 | 0 | 0 | 0 | 0 |
| 29.05.2022 21:00 - 22:00 | 0 | 0 | 0 | 0 |
| 29.05.2022 22:00 - 23:00 | 0 | 0 | 0 | 0 |
| 29.05.2022 23:00 - 24:00 | 0 | 0 | 0 | 0 |
| 30.05.2022 00:00 - 01:00 | 0 | 0 | 0 | 0 |
| 30.05.2022 01:00 - 02:00 | 0 | 0 | 0 | 0 |
| 30.05.2022 02:00 - 03:00 | 0 | 0 | 0 | 0 |
| 30.05.2022 03:00 - 04:00 | 0 | 0 | 0 | 0 |
| 30.05.2022 04:00 - 05:00 | 0 | 0 | 0 | 0 |
| 30.05.2022 05:00 - 06:00 | 0 | 0 | 0 | 0 |
| 30.05.2022 06:00 - 07:00 | 0 | 0 | 0 | 0 |
| 30.05.2022 07:00 - 08:00 | 0 | 0 | 0 | 0 |
| 30.05.2022 08:00 - 09:00 | 0 | 0 | 0 | 0 |
| 30.05.2022 09:00 - 10:00 | 0 | 0 | 0 | 0 |
| 30.05.2022 10:00 - 11:00 | 0 | 0 | 0 | 0 |
| 30.05.2022 11:00 - 12:00 | 0 | 0 | 0 | 0 |
| 30.05.2022 12:00 - 13:00 | 0 | 0 | 0 | 0 |
| 30.05.2022 13:00 - 14:00 | 0 | 0 | 0 | 0 |
| 30.05.2022 14:00 - 15:00 | 0 | 0 | 0 | 0 |
| 30.05.2022 15:00 - 16:00 | 0 | 0 | 0 | 0 |
| 30.05.2022 16:00 - 17:00 | 0 | 0 | 0 | 0 |
| 30.05.2022 17:00 - 18:00 | 0 | 0 | 0 | 0 |
| 30.05.2022 18:00 - 19:00 | 0 | 0 | 0 | 0 |
| 30.05.2022 19:00 - 20:00 | 0 | 0 | 0 | 0 |
| 30.05.2022 20:00 - 21:00 | 50 | 0 | 0 | 0 |
| 30.05.2022 21:00 - 22:00 | 50 | 0 | 0 | 0 |
| 30.05.2022 22:00 - 23:00 | 50 | 0 | 0 | 0 |
| 30.05.2022 23:00 - 24:00 | 50 | 0 | 0 | 0 |
| 31.05.2022 00:00 - 01:00 | 50 | 0 | 0 | 0 |
| 31.05.2022 01:00 - 02:00 | 50 | 0 | 0 | 0 |
| 31.05.2022 02:00 - 03:00 | 50 | 0 | 0 | 0 |
| 31.05.2022 03:00 - 04:00 | 150 | 0 | 0 | 0 |
| 31.05.2022 04:00 - 05:00 | 150 | 0 | 0 | 0 |
| 31.05.2022 05:00 - 06:00 | 150 | 0 | 0 | 0 |
| 31.05.2022 06:00 - 07:00 | 0 | 0 | 0 | 0 |
| 31.05.2022 07:00 - 08:00 | 0 | 0 | 0 | 0 |
| 31.05.2022 08:00 - 09:00 | 0 | 0 | 0 | 0 |
| 31.05.2022 09:00 - 10:00 | 0 | 0 | 0 | 0 |
| 31.05.2022 10:00 - 11:00 | 0 | 0 | 0 | 0 |
| 31.05.2022 11:00 - 12:00 | 0 | 0 | 0 | 0 |
| 31.05.2022 12:00 - 13:00 | 0 | 0 | 0 | 0 |
| 31.05.2022 13:00 - 14:00 | 0 | 0 | 0 | 0 |
| 31.05.2022 14:00 - 15:00 | 0 | 0 | 0 | 0 |
| 31.05.2022 15:00 - 16:00 | 0 | 0 | 0 | 0 |
| 31.05.2022 16:00 - 17:00 | 0 | 0 | 0 | 0 |
| 31.05.2022 17:00 - 18:00 | 0 | 0 | 0 | 0 |
| 31.05.2022 18:00 - 19:00 | 0 | 0 | 0 | 0 |
| 31.05.2022 19:00 - 20:00 | 50 | 0 | 0 | 0 |
| 31.05.2022 20:00 - 21:00 | 50 | 0 | 0 | 0 |
| 31.05.2022 21:00 - 22:00 | 50 | 0 | 0 | 0 |
| 31.05.2022 22:00 - 23:00 | 100 | 0 | 0 | 0 |
| 31.05.2022 23:00 - 24:00 | 100 | 0 | 0 | 0 |
| 01.06.2022 00:00 - 01:00 | 100 | 0 | 0 | 0 |
| 01.06.2022 01:00 - 02:00 | 100 | 0 | 0 | 0 |
| 01.06.2022 02:00 - 03:00 | 100 | 0 | 0 | 0 |
| 01.06.2022 03:00 - 04:00 | 100 | 0 | 0 | 0 |
| 01.06.2022 04:00 - 05:00 | 100 | 0 | 0 | 0 |
| 01.06.2022 05:00 - 06:00 | 100 | 0 | 0 | 0 |